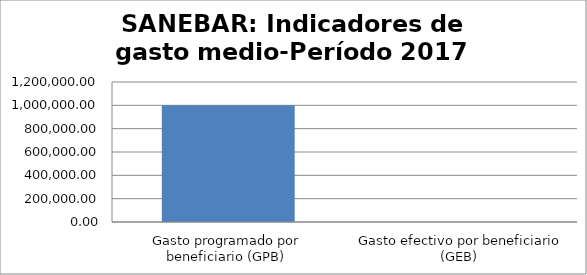
| Category | Series 0 |
|---|---|
| Gasto programado por beneficiario (GPB)  | 1000000 |
| Gasto efectivo por beneficiario (GEB)  | 0 |